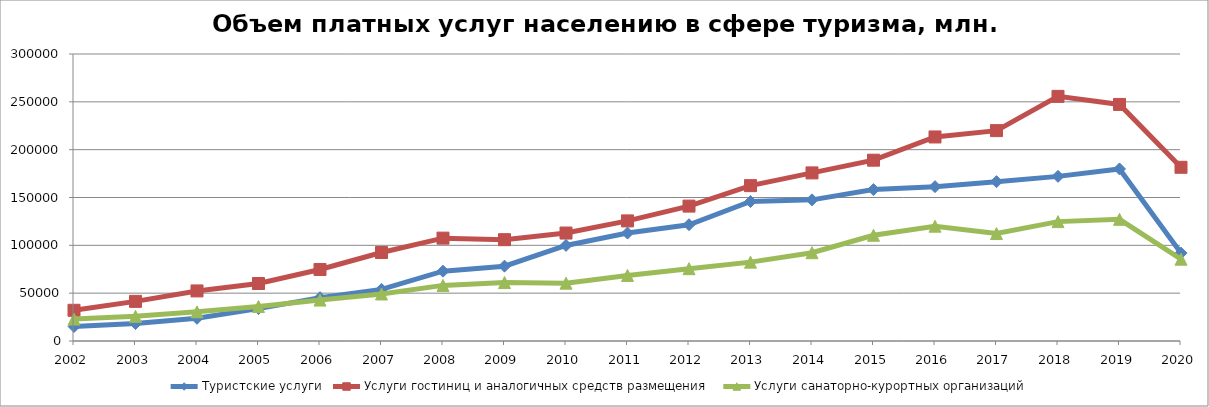
| Category | Туристские услуги | Услуги гостиниц и аналогичных средств размещения | Услуги санаторно-курортных организаций |
|---|---|---|---|
| 2002.0 | 15156.784 | 32103.639 | 22902.027 |
| 2003.0 | 18251.163 | 41429.807 | 25770.583 |
| 2004.0 | 23766.615 | 52341.684 | 30469.24 |
| 2005.0 | 33848.803 | 60098.124 | 36082.437 |
| 2006.0 | 45312.019 | 74743.723 | 42765.604 |
| 2007.0 | 53960.576 | 92479.57 | 49158.453 |
| 2008.0 | 72975.461 | 107521.663 | 58124.687 |
| 2009.0 | 78227.59 | 105903.557 | 61090.111 |
| 2010.0 | 99879 | 112855 | 60460 |
| 2011.0 | 112829 | 125541 | 68521 |
| 2012.0 | 121545 | 141012 | 75622 |
| 2013.0 | 145784 | 162387 | 82444 |
| 2014.0 | 147541 | 175709 | 92300 |
| 2015.0 | 158252 | 188992 | 110513 |
| 2016.0 | 161344 | 213288 | 120009 |
| 2017.0 | 166520 | 219916 | 112305 |
| 2018.0 | 172090 | 255708 | 124783 |
| 2019.0 | 179826 | 247279 | 127186 |
| 2020.0 | 91884 | 181577 | 85527 |